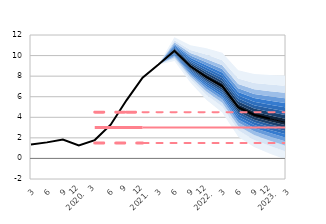
| Category | Series 5 | Series 20 | Series 25 | Series 24 | Series 23 |
|---|---|---|---|---|---|
| 3 | 1.344 |  | 3 | 1.5 | 4.5 |
| 6 | 1.561 |  | 3 | 1.5 | 4.5 |
| 9 | 1.836 |  | 3 | 1.5 | 4.5 |
| 12
2020. | 1.251 |  | 3 | 1.5 | 4.5 |
| 3
 | 1.784 |  | 3 | 1.5 | 4.5 |
| 6 | 3.281 |  | 3 | 1.5 | 4.5 |
| 9
 | 5.675 |  | 3 | 1.5 | 4.5 |
| 12
2021. | 7.851 |  | 3 | 1.5 | 4.5 |
| 3 | 9.121 |  | 3 | 1.5 | 4.5 |
| 6 | 10.46 |  | 3 | 1.5 | 4.5 |
| 9 | 8.957 |  | 3 | 1.5 | 4.5 |
| 12
2022. | 7.917 |  | 3 | 1.5 | 4.5 |
| 3 | 7.039 |  | 3 | 1.5 | 4.5 |
| 6 | 4.97 |  | 3 | 1.5 | 4.5 |
| 9 | 4.249 |  | 3 | 1.5 | 4.5 |
| 12
2023. | 3.853 |  | 3 | 1.5 | 4.5 |
| 3 | 3.5 |  | 3 | 1.5 | 4.5 |